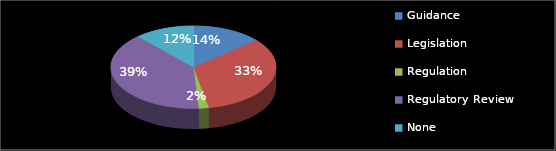
| Category | Series 0 |
|---|---|
| Guidance | 7 |
| Legislation | 17 |
| Regulation | 1 |
| Regulatory Review | 20 |
| None | 6 |